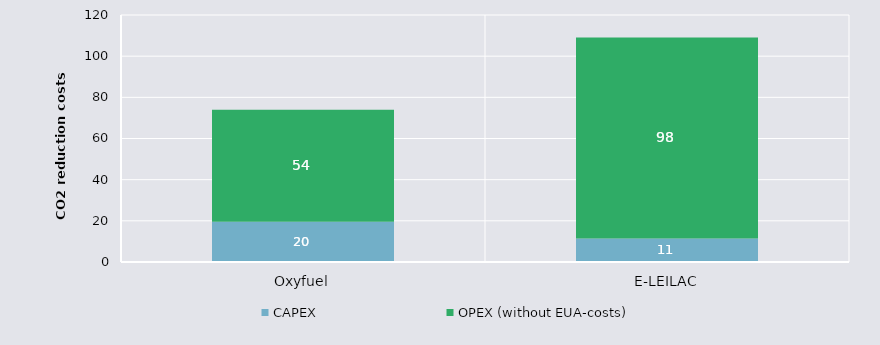
| Category | CAPEX | OPEX (without EUA-costs) |
|---|---|---|
| Oxyfuel | 19.504 | 54.411 |
| E-LEILAC | 11.466 | 97.568 |